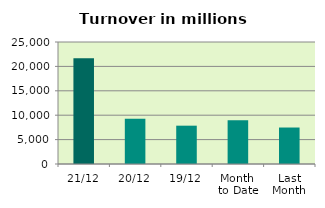
| Category | Series 0 |
|---|---|
| 21/12 | 21686.406 |
| 20/12 | 9256.137 |
| 19/12 | 7853.284 |
| Month 
to Date | 8940.944 |
| Last
Month | 7475.09 |